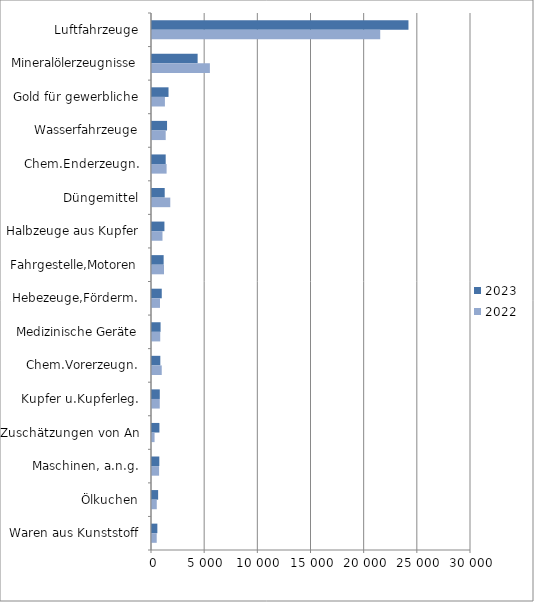
| Category | 2023 | 2022 |
|---|---|---|
| Luftfahrzeuge | 24118.379 | 21462.323 |
| Mineralölerzeugnisse | 4290.997 | 5444.382 |
| Gold für gewerbliche | 1553.249 | 1214.9 |
| Wasserfahrzeuge | 1415.103 | 1288.401 |
| Chem.Enderzeugn. | 1288.108 | 1373.07 |
| Düngemittel | 1194.611 | 1718.294 |
| Halbzeuge aus Kupfer | 1168.893 | 986.751 |
| Fahrgestelle,Motoren | 1095.676 | 1127.823 |
| Hebezeuge,Förderm. | 918.207 | 750.683 |
| Medizinische Geräte | 806.565 | 774.089 |
| Chem.Vorerzeugn. | 782.412 | 916.232 |
| Kupfer u.Kupferleg. | 732.745 | 730.097 |
| Zuschätzungen von An | 698.112 | 241.386 |
| Maschinen, a.n.g. | 687.922 | 666.678 |
| Ölkuchen | 576.698 | 449.589 |
| Waren aus Kunststoff | 503.21 | 443.579 |